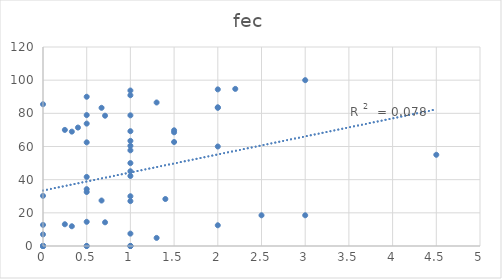
| Category | fec |
|---|---|
| 2.0 | 83.636 |
| 2.0 | 94.444 |
| 3.0 | 100 |
| 1.5 | 62.712 |
| 1.5 | 69.767 |
| 1.5 | 68.571 |
| 2.0 | 60 |
| 2.0 | 83.333 |
| 1.3 | 4.878 |
| 2.5 | 18.519 |
| 3.0 | 18.519 |
| 1.3 | 86.538 |
| 4.5 | 55 |
| 2.2 | 94.737 |
| 1.4 | 28.333 |
| 2.0 | 12.5 |
| 1.0 | 27.083 |
| 1.0 | 42.222 |
| 1.0 | 69.231 |
| 1.0 | 0 |
| 1.0 | 7.463 |
| 1.0 | 0 |
| 1.0 | 50 |
| 1.0 | 45.07 |
| 1.0 | 60.417 |
| 1.0 | 93.75 |
| 1.0 | 57.692 |
| 1.0 | 78.788 |
| 1.0 | 63.415 |
| 1.0 | 30 |
| 1.0 | 90.909 |
| 1.0 | 0 |
| 1.0 | 0 |
| 0.0 | 0 |
| 0.0 | 30.233 |
| 0.0 | 0 |
| 0.0 | 0 |
| 0.0 | 0 |
| 0.0 | 85.484 |
| 0.0 | 12.727 |
| 0.0 | 6.977 |
| 0.5 | 0 |
| 0.5 | 62.5 |
| 0.5 | 73.81 |
| 0.5 | 32.558 |
| 0.5 | 0 |
| 0.5 | 14.583 |
| 0.5 | 78.947 |
| 0.5 | 34.286 |
| 0.5 | 41.667 |
| 0.5 | 90 |
| 0.33 | 68.966 |
| 0.33 | 11.905 |
| 0.25 | 13.115 |
| 0.25 | 70 |
| 0.67 | 27.419 |
| 0.4 | 71.429 |
| 0.71 | 78.571 |
| 0.71 | 14.286 |
| 0.67 | 83.333 |